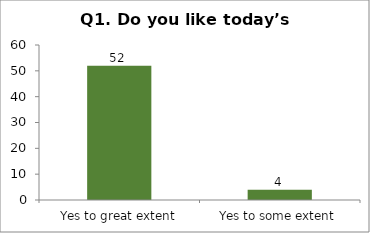
| Category | Q1. Do you like today’s session? |
|---|---|
| Yes to great extent | 52 |
| Yes to some extent | 4 |